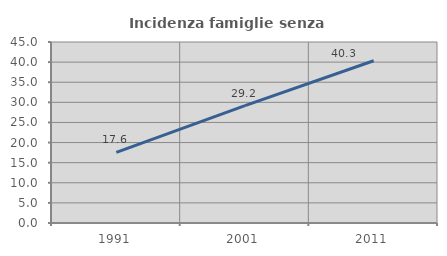
| Category | Incidenza famiglie senza nuclei |
|---|---|
| 1991.0 | 17.551 |
| 2001.0 | 29.186 |
| 2011.0 | 40.345 |